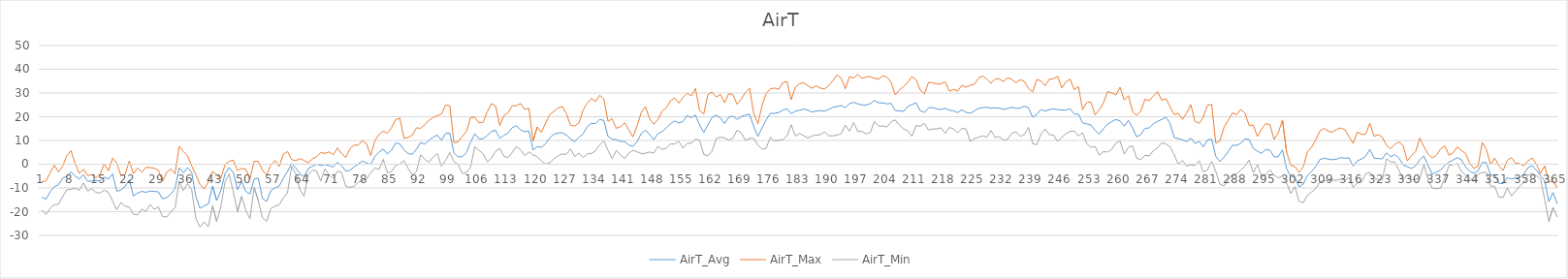
| Category | AirT_Avg | AirT_Max | AirT_Min |
|---|---|---|---|
| 0 | -13.88 | -7.48 | -19.23 |
| 1 | -14.71 | -6.97 | -21.18 |
| 2 | -11.58 | -3.59 | -18.58 |
| 3 | -9.47 | -0.46 | -17.01 |
| 4 | -8.62 | -3.24 | -16.91 |
| 5 | -5.87 | -0.86 | -13.71 |
| 6 | -5.19 | 3.64 | -10.73 |
| 7 | -3.19 | 5.67 | -10.53 |
| 8 | -5.05 | 0.3 | -10.09 |
| 9 | -6.25 | -3.89 | -11.01 |
| 10 | -4.37 | -2.12 | -7.87 |
| 11 | -7.23 | -4.78 | -11.32 |
| 12 | -7.06 | -4.43 | -10.33 |
| 13 | -6.81 | -5.67 | -11.87 |
| 14 | -6.98 | -4.26 | -12.17 |
| 15 | -5.49 | 0.23 | -10.95 |
| 16 | -6.29 | -2.76 | -11.86 |
| 17 | -4.11 | 2.53 | -15.49 |
| 18 | -11.42 | 0.42 | -19.17 |
| 19 | -10.88 | -4.74 | -16.13 |
| 20 | -9.34 | -4.41 | -17.74 |
| 21 | -6.61 | 1.29 | -18.08 |
| 22 | -13.38 | -3.94 | -21.08 |
| 23 | -12.14 | -1.61 | -21.32 |
| 24 | -11.44 | -3.38 | -18.89 |
| 25 | -11.84 | -1.33 | -19.95 |
| 26 | -11.33 | -1.42 | -17.01 |
| 27 | -11.49 | -1.72 | -19.06 |
| 28 | -11.62 | -2.57 | -18.04 |
| 29 | -14.62 | -7.18 | -22.07 |
| 30 | -14.06 | -3.43 | -22.24 |
| 31 | -12.55 | -1.99 | -19.99 |
| 32 | -10.19 | -4.03 | -18.42 |
| 33 | -1.57 | 7.51 | -7.39 |
| 34 | -3.63 | 5.32 | -11.16 |
| 35 | -1.42 | 3.53 | -8.15 |
| 36 | -3.37 | -0.69 | -10.71 |
| 37 | -13.66 | -4.47 | -22.83 |
| 38 | -18.61 | -8.54 | -26.48 |
| 39 | -17.54 | -10.48 | -24.29 |
| 40 | -16.83 | -7.42 | -26.38 |
| 41 | -9.17 | -3.13 | -17.46 |
| 42 | -15.25 | -4.48 | -24.16 |
| 43 | -11.16 | -6.03 | -17.97 |
| 44 | -4.04 | -0.28 | -7.5 |
| 45 | -1.39 | 1.23 | -4.06 |
| 46 | -3.51 | 1.68 | -11.77 |
| 47 | -10.75 | -2.71 | -19.99 |
| 48 | -7.37 | -1.75 | -13.54 |
| 49 | -11.48 | -2.11 | -19.44 |
| 50 | -12.51 | -6.14 | -22.92 |
| 51 | -6.23 | 1.23 | -9.68 |
| 52 | -5.89 | 1.17 | -15.49 |
| 53 | -14.46 | -2.5 | -22.51 |
| 54 | -15.68 | -4.56 | -24.12 |
| 55 | -11.16 | -0.41 | -18.69 |
| 56 | -10 | 1.57 | -17.66 |
| 57 | -9.29 | -1 | -17.19 |
| 58 | -5.95 | 4.2 | -14.19 |
| 59 | -3.13 | 5.32 | -12.11 |
| 60 | 0.34 | 1.91 | -0.93 |
| 61 | -1.63 | 1.51 | -4.09 |
| 62 | -3.98 | 2.36 | -10.78 |
| 63 | -5.29 | 1.57 | -13.5 |
| 64 | -1.84 | 0.57 | -4.26 |
| 65 | -0.81 | 2.25 | -2.49 |
| 66 | -0.01 | 3.08 | -2.87 |
| 67 | -0.52 | 4.88 | -7.09 |
| 68 | -0.09 | 4.61 | -2.02 |
| 69 | -0.64 | 5.19 | -4.54 |
| 70 | -1.21 | 3.99 | -5.93 |
| 71 | 0.76 | 6.83 | -2.91 |
| 72 | -0.57 | 4.49 | -3.51 |
| 73 | -2.95 | 2.83 | -9.34 |
| 74 | -2.55 | 6.52 | -9.68 |
| 75 | -1.12 | 8.07 | -9.37 |
| 76 | 0.07 | 8.04 | -7.63 |
| 77 | 1.37 | 9.94 | -6.82 |
| 78 | 0.56 | 8.65 | -6.37 |
| 79 | -0.2 | 3.64 | -3.62 |
| 80 | 3.38 | 9.92 | -1.57 |
| 81 | 5.13 | 12.58 | -2.29 |
| 82 | 6.37 | 13.95 | 2.07 |
| 83 | 4.3 | 13.01 | -3.62 |
| 84 | 5.88 | 15.4 | -3.14 |
| 85 | 8.92 | 18.8 | -0.48 |
| 86 | 8.54 | 19.34 | 0.09 |
| 87 | 5.98 | 10.92 | 1.58 |
| 88 | 4.49 | 11.24 | -1.81 |
| 89 | 4.16 | 12.29 | -4.67 |
| 90 | 6.41 | 15.33 | -3.03 |
| 91 | 9.16 | 15.09 | 4.04 |
| 92 | 8.39 | 16.7 | 2.04 |
| 93 | 10.11 | 18.57 | 0.84 |
| 94 | 11.35 | 19.63 | 3.02 |
| 95 | 12.29 | 20.52 | 4.52 |
| 96 | 10.04 | 21.16 | -0.88 |
| 97 | 13.01 | 24.97 | 1.67 |
| 98 | 13.07 | 24.6 | 4.89 |
| 99 | 4.71 | 9.01 | 1.15 |
| 100 | 3.15 | 9.48 | -0.11 |
| 101 | 3.15 | 11.73 | -3.92 |
| 102 | 4.95 | 13.77 | -3.48 |
| 103 | 9.34 | 19.77 | -1.16 |
| 104 | 12.88 | 19.67 | 7.38 |
| 105 | 10.66 | 17.39 | 5.84 |
| 106 | 10.71 | 17.68 | 4.42 |
| 107 | 12.08 | 22.11 | 0.94 |
| 108 | 13.8 | 25.52 | 2.62 |
| 109 | 14.3 | 24.53 | 5.44 |
| 110 | 10.88 | 16.3 | 6.7 |
| 111 | 12.2 | 20.44 | 3.22 |
| 112 | 13.08 | 21.7 | 2.82 |
| 113 | 15.43 | 24.63 | 5 |
| 114 | 16.17 | 24.63 | 7.48 |
| 115 | 14.47 | 25.59 | 6.08 |
| 116 | 13.71 | 23.07 | 3.6 |
| 117 | 14.01 | 23.55 | 5.13 |
| 118 | 5.96 | 9.83 | 3.94 |
| 119 | 7.43 | 15.67 | 3.19 |
| 120 | 7.09 | 13.36 | 1.33 |
| 121 | 8.62 | 17.34 | -0.01 |
| 122 | 11.1 | 20.81 | 0.57 |
| 123 | 12.58 | 22.31 | 2.21 |
| 124 | 13.17 | 23.68 | 3.54 |
| 125 | 13.27 | 24.32 | 4.29 |
| 126 | 12.26 | 21.29 | 4.18 |
| 127 | 10.69 | 16.39 | 6.43 |
| 128 | 9.49 | 16.08 | 3.26 |
| 129 | 11.37 | 17.3 | 4.72 |
| 130 | 12.72 | 22.76 | 2.76 |
| 131 | 15.79 | 25.69 | 4.35 |
| 132 | 17.23 | 27.67 | 4.52 |
| 133 | 17.14 | 26.37 | 5.61 |
| 134 | 18.9 | 29.06 | 8.19 |
| 135 | 18.39 | 27.44 | 9.93 |
| 136 | 11.72 | 18.09 | 5.84 |
| 137 | 10.51 | 19.14 | 2.34 |
| 138 | 10.36 | 15.14 | 5.82 |
| 139 | 9.63 | 15.78 | 3.94 |
| 140 | 9.52 | 17.44 | 2.41 |
| 141 | 8.08 | 14.42 | 4.69 |
| 142 | 7.53 | 11.47 | 5.81 |
| 143 | 9.59 | 16.23 | 5.21 |
| 144 | 12.97 | 21.87 | 4.45 |
| 145 | 14.33 | 24.29 | 4.62 |
| 146 | 12.44 | 19.02 | 5.17 |
| 147 | 10.35 | 16.87 | 4.69 |
| 148 | 12.87 | 18.94 | 7.55 |
| 149 | 13.74 | 22.31 | 6.19 |
| 150 | 15.26 | 23.81 | 6.67 |
| 151 | 17.06 | 26.72 | 8.53 |
| 152 | 18.22 | 27.94 | 8.51 |
| 153 | 17.38 | 25.79 | 9.69 |
| 154 | 17.92 | 28.11 | 6.8 |
| 155 | 20.5 | 29.89 | 8.77 |
| 156 | 19.57 | 28.78 | 8.84 |
| 157 | 20.69 | 31.89 | 10.58 |
| 158 | 16.58 | 22.72 | 10.13 |
| 159 | 13.31 | 21.19 | 4.14 |
| 160 | 16.61 | 29.39 | 3.57 |
| 161 | 19.74 | 30.39 | 5.54 |
| 162 | 20.63 | 28.33 | 10.78 |
| 163 | 19.49 | 29.39 | 11.4 |
| 164 | 17.12 | 25.89 | 11.06 |
| 165 | 19.78 | 29.72 | 10.14 |
| 166 | 20.24 | 29.28 | 10.96 |
| 167 | 18.84 | 25.28 | 14.32 |
| 168 | 20.03 | 27.39 | 13.17 |
| 169 | 20.7 | 30.22 | 10.1 |
| 170 | 21.08 | 32.06 | 10.86 |
| 171 | 15.99 | 21.39 | 10.96 |
| 172 | 11.63 | 17.04 | 8.09 |
| 173 | 15.38 | 24.77 | 6.29 |
| 174 | 18.71 | 29.83 | 6.8 |
| 175 | 21.42 | 31.67 | 11.33 |
| 176 | 21.43 | 32.11 | 9.76 |
| 177 | 21.78 | 31.56 | 10.1 |
| 178 | 22.81 | 34.33 | 10.31 |
| 179 | 23.37 | 34.83 | 11.91 |
| 180 | 21.31 | 27.17 | 16.71 |
| 181 | 22.34 | 32.44 | 11.84 |
| 182 | 22.72 | 33.89 | 12.97 |
| 183 | 23.21 | 34.33 | 12.01 |
| 184 | 22.8 | 33.11 | 11.02 |
| 185 | 21.94 | 32 | 11.97 |
| 186 | 22.42 | 33 | 12.25 |
| 187 | 22.6 | 32.06 | 12.42 |
| 188 | 22.29 | 31.67 | 13.58 |
| 189 | 23.08 | 33.11 | 11.98 |
| 190 | 23.96 | 35.22 | 11.94 |
| 191 | 24.28 | 37.61 | 12.28 |
| 192 | 24.76 | 36.33 | 12.83 |
| 193 | 23.8 | 31.83 | 16.47 |
| 194 | 25.55 | 36.89 | 13.89 |
| 195 | 26.05 | 36.28 | 17.58 |
| 196 | 25.43 | 37.83 | 13.71 |
| 197 | 25 | 36.17 | 13.85 |
| 198 | 24.92 | 36.78 | 12.73 |
| 199 | 25.56 | 36.89 | 13.38 |
| 200 | 26.84 | 36.17 | 17.99 |
| 201 | 25.87 | 35.83 | 16.02 |
| 202 | 25.79 | 37.28 | 16.09 |
| 203 | 25.44 | 36.72 | 15.66 |
| 204 | 25.59 | 34.44 | 17.87 |
| 205 | 22.6 | 29.22 | 18.64 |
| 206 | 22.42 | 31.33 | 16.43 |
| 207 | 22.26 | 32.72 | 14.84 |
| 208 | 24.35 | 34.5 | 14.09 |
| 209 | 25.15 | 36.89 | 11.74 |
| 210 | 25.86 | 35.61 | 16.29 |
| 211 | 22.51 | 31.22 | 16.02 |
| 212 | 21.86 | 29.67 | 17.22 |
| 213 | 23.76 | 34.5 | 14.39 |
| 214 | 23.87 | 34.33 | 14.84 |
| 215 | 23.26 | 33.72 | 14.87 |
| 216 | 23.02 | 33.89 | 15.34 |
| 217 | 23.56 | 34.67 | 13.01 |
| 218 | 22.75 | 30.78 | 15.48 |
| 219 | 22.44 | 31.5 | 14.87 |
| 220 | 21.77 | 30.83 | 13.24 |
| 221 | 22.91 | 33.28 | 15.14 |
| 222 | 21.87 | 32.44 | 14.87 |
| 223 | 21.43 | 33.28 | 9.56 |
| 224 | 22.43 | 33.67 | 10.75 |
| 225 | 23.57 | 36.33 | 11.39 |
| 226 | 23.8 | 37.17 | 11.94 |
| 227 | 23.99 | 35.89 | 11.33 |
| 228 | 23.65 | 34.06 | 14.22 |
| 229 | 23.75 | 36 | 11.26 |
| 230 | 23.61 | 35.94 | 11.57 |
| 231 | 23.09 | 34.83 | 10.24 |
| 232 | 23.49 | 36.44 | 10.41 |
| 233 | 24.01 | 35.72 | 13.06 |
| 234 | 23.53 | 34.33 | 13.65 |
| 235 | 23.62 | 35.56 | 11.74 |
| 236 | 24.47 | 34.89 | 12.52 |
| 237 | 23.75 | 31.94 | 15.58 |
| 238 | 19.85 | 30.39 | 8.71 |
| 239 | 20.94 | 35.72 | 8.2 |
| 240 | 23.03 | 35.11 | 12.69 |
| 241 | 22.4 | 33.06 | 14.87 |
| 242 | 22.97 | 35.83 | 12.42 |
| 243 | 23.31 | 36 | 12.29 |
| 244 | 22.99 | 37.06 | 9.56 |
| 245 | 22.8 | 32.11 | 11.37 |
| 246 | 22.83 | 34.72 | 12.93 |
| 247 | 23.37 | 35.83 | 13.82 |
| 248 | 21.13 | 31.44 | 13.99 |
| 249 | 21.08 | 32.67 | 11.91 |
| 250 | 17.41 | 22.97 | 13.24 |
| 251 | 16.99 | 26.03 | 8.67 |
| 252 | 16.54 | 26.17 | 7.04 |
| 253 | 14.26 | 20.82 | 7.48 |
| 254 | 12.7 | 22.89 | 3.84 |
| 255 | 14.95 | 25.83 | 5.31 |
| 256 | 16.82 | 30.61 | 5.13 |
| 257 | 17.97 | 30.06 | 6.33 |
| 258 | 18.86 | 29.22 | 8.84 |
| 259 | 18.26 | 32.44 | 9.77 |
| 260 | 16 | 27.06 | 4.28 |
| 261 | 18.45 | 28.89 | 7.16 |
| 262 | 15.24 | 22.12 | 7.71 |
| 263 | 11.48 | 20.57 | 2.49 |
| 264 | 12.58 | 22.37 | 1.92 |
| 265 | 15.09 | 27.39 | 3.82 |
| 266 | 15.26 | 26.72 | 3.46 |
| 267 | 17.02 | 28.78 | 5.75 |
| 268 | 18.06 | 30.56 | 6.83 |
| 269 | 18.86 | 26.94 | 9.05 |
| 270 | 19.79 | 27.61 | 8.57 |
| 271 | 17.26 | 24.21 | 7.41 |
| 272 | 11.25 | 20.92 | 4 |
| 273 | 10.76 | 21.38 | -0.09 |
| 274 | 10.29 | 18.88 | 1.64 |
| 275 | 9.46 | 21.54 | -0.85 |
| 276 | 10.97 | 25.08 | -0.28 |
| 277 | 8.72 | 18.03 | -0.59 |
| 278 | 9.63 | 17.21 | 1.47 |
| 279 | 7.31 | 19.82 | -3.28 |
| 280 | 10.18 | 24.77 | -2.37 |
| 281 | 10.58 | 25.19 | 1.13 |
| 282 | 3.26 | 8.88 | -3.07 |
| 283 | 1.09 | 9.86 | -8.43 |
| 284 | 3.03 | 15.74 | -9.11 |
| 285 | 5.43 | 18.62 | -6.6 |
| 286 | 8.02 | 21.62 | -4.27 |
| 287 | 7.94 | 20.85 | -4.15 |
| 288 | 8.76 | 23.09 | -2.47 |
| 289 | 10.71 | 21.54 | -0.84 |
| 290 | 10.35 | 16.33 | 1.8 |
| 291 | 6.62 | 16.49 | -3.63 |
| 292 | 5.53 | 11.67 | -0.15 |
| 293 | 4.57 | 14.93 | -5.18 |
| 294 | 6.27 | 17.09 | -4.37 |
| 295 | 5.93 | 16.66 | -2.45 |
| 296 | 3.06 | 10.38 | -4.53 |
| 297 | 3.15 | 13.22 | -5.83 |
| 298 | 6.05 | 18.6 | -4.81 |
| 299 | -1.89 | 5.19 | -7.88 |
| 300 | -5.06 | -0.52 | -12.36 |
| 301 | -5.5 | -0.97 | -9.48 |
| 302 | -9.55 | -3.48 | -15.54 |
| 303 | -8.4 | -1.13 | -16.25 |
| 304 | -4.73 | 5.34 | -13.08 |
| 305 | -2.99 | 7.15 | -11.72 |
| 306 | -1 | 10.23 | -10.31 |
| 307 | 1.99 | 13.99 | -7.52 |
| 308 | 2.48 | 15.05 | -6.84 |
| 309 | 2.19 | 13.94 | -6.96 |
| 310 | 1.89 | 13.45 | -6.67 |
| 311 | 2.11 | 14.62 | -6.84 |
| 312 | 2.78 | 15.28 | -6.26 |
| 313 | 2.53 | 14.53 | -6.72 |
| 314 | 2.66 | 11.56 | -5.66 |
| 315 | -0.82 | 8.78 | -9.82 |
| 316 | 1.42 | 13.55 | -7.86 |
| 317 | 2.15 | 12.54 | -7.53 |
| 318 | 3.33 | 12.63 | -3.99 |
| 319 | 6.22 | 17.31 | -3.47 |
| 320 | 2.61 | 11.77 | -5.81 |
| 321 | 2.41 | 12.5 | -6.53 |
| 322 | 2.24 | 11.36 | -6.73 |
| 323 | 4.83 | 7.91 | 2.33 |
| 324 | 3.07 | 6.57 | 0.95 |
| 325 | 4.06 | 8.36 | 0.95 |
| 326 | 2.6 | 9.41 | -2.61 |
| 327 | -0.25 | 7.79 | -6.41 |
| 328 | -1.05 | 1.38 | -4.51 |
| 329 | -1.78 | 3.69 | -6.48 |
| 330 | -0.72 | 5.28 | -6.39 |
| 331 | 1.93 | 11.02 | -5.81 |
| 332 | 3.44 | 7.31 | -0.19 |
| 333 | -0.65 | 4.24 | -6.77 |
| 334 | -4.25 | 2.65 | -10.12 |
| 335 | -3.34 | 3.77 | -10.34 |
| 336 | -2.48 | 6.44 | -10.09 |
| 337 | -0.5 | 7.72 | -5.78 |
| 338 | 0.85 | 3.81 | -0.56 |
| 339 | 1.77 | 4.77 | -0.19 |
| 340 | 2.74 | 7.26 | 0.28 |
| 341 | 1.88 | 5.76 | -3.12 |
| 342 | -1.14 | 4.44 | -4.63 |
| 343 | -3 | 0.36 | -6.16 |
| 344 | -3.81 | -1.83 | -7.19 |
| 345 | -2.78 | -0.76 | -4.07 |
| 346 | 0.75 | 9.19 | -3.54 |
| 347 | 0.66 | 6.17 | -3.44 |
| 348 | -4.61 | -0.16 | -9.21 |
| 349 | -4.58 | 2.59 | -9.43 |
| 350 | -8.05 | -0.63 | -13.85 |
| 351 | -8.17 | -2.69 | -14.05 |
| 352 | -5.64 | 1.63 | -9.97 |
| 353 | -6.23 | 2.74 | -13.36 |
| 354 | -5.77 | 0.43 | -11.38 |
| 355 | -5.64 | 0.2 | -9.23 |
| 356 | -4.14 | -0.68 | -7.7 |
| 357 | -1.4 | 1.41 | -4.64 |
| 358 | -0.62 | 2.6 | -3.89 |
| 359 | -2.55 | 0.03 | -4.86 |
| 360 | -4.83 | -3.96 | -6.06 |
| 361 | -7.05 | -0.64 | -14.81 |
| 362 | -15.8 | -7.68 | -24.12 |
| 363 | -11.93 | -6.97 | -18.14 |
| 364 | -16.65 | -9.94 | -22.32 |